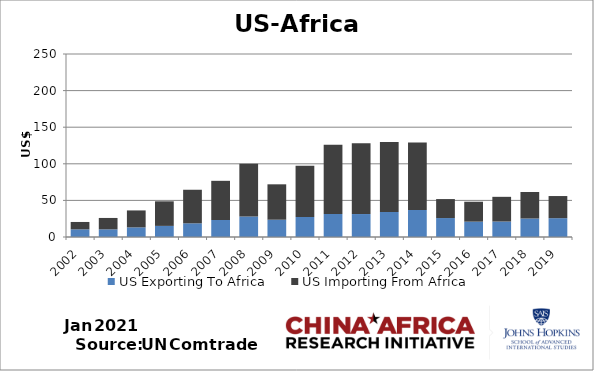
| Category | US Exporting To Africa | US Importing From Africa |
|---|---|---|
| 2002.0 | 10.457 | 10.079 |
| 2003.0 | 10.457 | 15.566 |
| 2004.0 | 13.153 | 23.149 |
| 2005.0 | 15.169 | 33.577 |
| 2006.0 | 18.702 | 45.843 |
| 2007.0 | 23.229 | 53.516 |
| 2008.0 | 28.01 | 72.068 |
| 2009.0 | 23.63 | 48.342 |
| 2010.0 | 27.33 | 70.041 |
| 2011.0 | 31.513 | 94.573 |
| 2012.0 | 31.375 | 96.572 |
| 2013.0 | 34.237 | 95.698 |
| 2014.0 | 36.854 | 92.148 |
| 2015.0 | 25.893 | 25.928 |
| 2016.0 | 20.98 | 27.207 |
| 2017.0 | 21.149 | 33.726 |
| 2018.0 | 25.261 | 36.217 |
| 2019.0 | 25.728 | 30.228 |